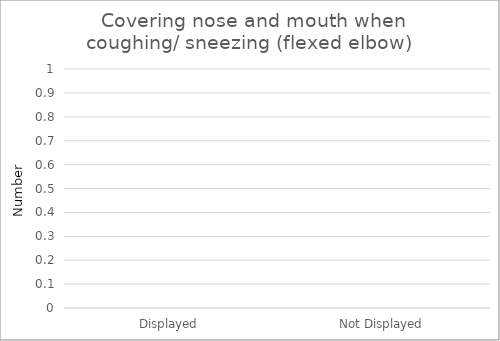
| Category | Covering nose and mouth when coughing/ sneezing (flexed elbow)  |
|---|---|
| Displayed | 0 |
| Not Displayed | 0 |